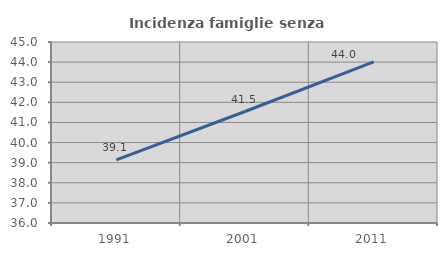
| Category | Incidenza famiglie senza nuclei |
|---|---|
| 1991.0 | 39.142 |
| 2001.0 | 41.543 |
| 2011.0 | 44.012 |